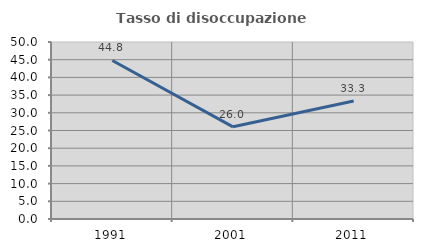
| Category | Tasso di disoccupazione giovanile  |
|---|---|
| 1991.0 | 44.788 |
| 2001.0 | 26.036 |
| 2011.0 | 33.333 |